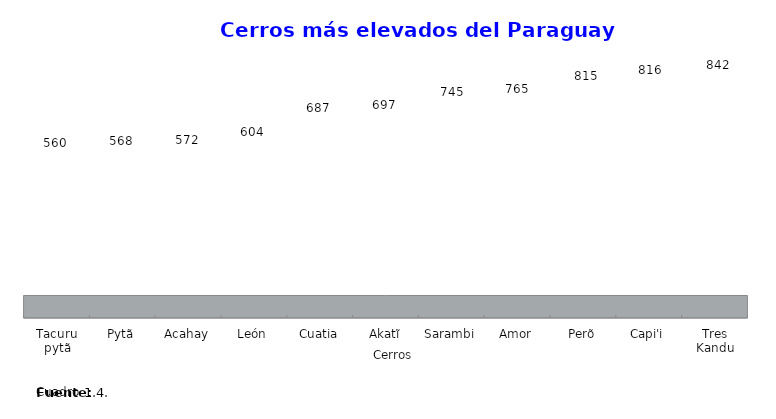
| Category | Altura (m) |
|---|---|
| Tacuru pytã | 560 |
| Pytã | 568 |
| Acahay | 572 |
| León | 604 |
| Cuatia | 687 |
| Akatĩ | 697 |
| Sarambi | 745 |
| Amor | 765 |
| Perõ | 815 |
| Capi'i | 816 |
| Tres Kandu | 842 |